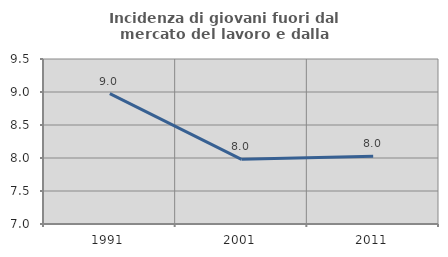
| Category | Incidenza di giovani fuori dal mercato del lavoro e dalla formazione  |
|---|---|
| 1991.0 | 8.974 |
| 2001.0 | 7.98 |
| 2011.0 | 8.025 |